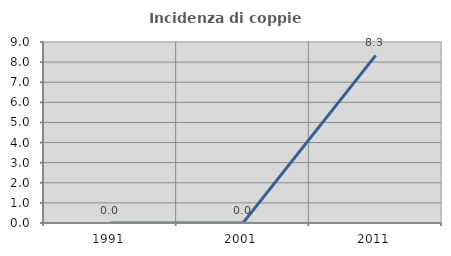
| Category | Incidenza di coppie miste |
|---|---|
| 1991.0 | 0 |
| 2001.0 | 0 |
| 2011.0 | 8.333 |